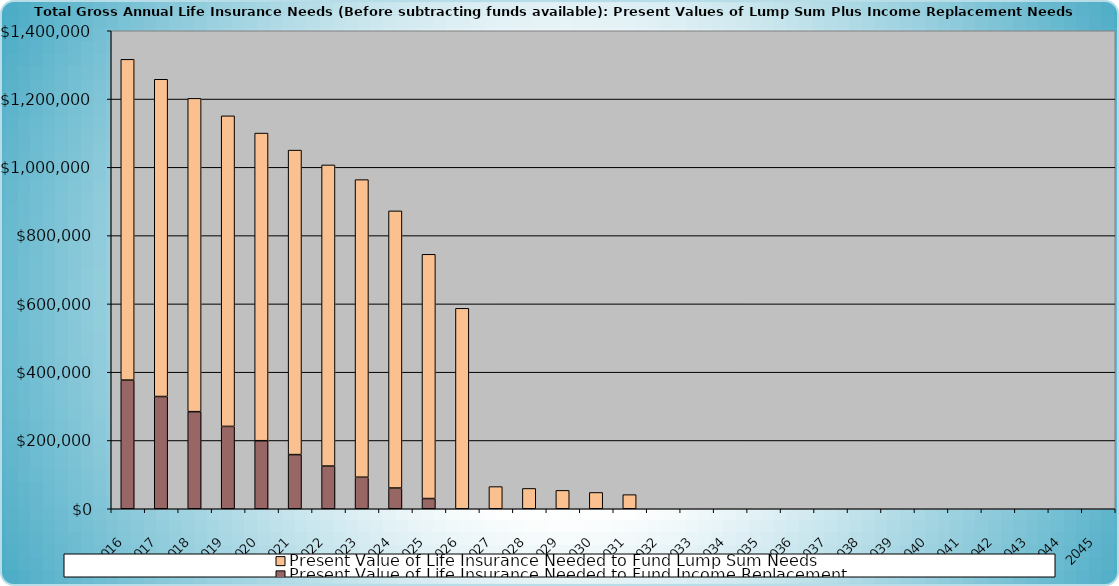
| Category | Present Value of Life Insurance Needed to Fund Income Replacement | Present Value of Life Insurance Needed to Fund Lump Sum Needs |
|---|---|---|
| 2016.0 | 376738.288 | 939583.285 |
| 2017.0 | 328738.288 | 929200.585 |
| 2018.0 | 284330.125 | 917685.33 |
| 2019.0 | 241190.766 | 909621.246 |
| 2020.0 | 199283.961 | 901018.512 |
| 2021.0 | 158574.493 | 891841.082 |
| 2022.0 | 124994.8 | 882050.492 |
| 2023.0 | 92374.527 | 871605.699 |
| 2024.0 | 60686.261 | 811715.783 |
| 2025.0 | 29903.375 | 715379.71 |
| 2026.0 | 0 | 587133.604 |
| 2027.0 | 0 | 64893.925 |
| 2028.0 | 0 | 59521.704 |
| 2029.0 | 0 | 53818.598 |
| 2030.0 | 0 | 47764.327 |
| 2031.0 | 0 | 41337.371 |
| 2032.0 | 0 | 0 |
| 2033.0 | 0 | 0 |
| 2034.0 | 0 | 0 |
| 2035.0 | 0 | 0 |
| 2036.0 | 0 | 0 |
| 2037.0 | 0 | 0 |
| 2038.0 | 0 | 0 |
| 2039.0 | 0 | 0 |
| 2040.0 | 0 | 0 |
| 2041.0 | 0 | 0 |
| 2042.0 | 0 | 0 |
| 2043.0 | 0 | 0 |
| 2044.0 | 0 | 0 |
| 2045.0 | 0 | 0 |